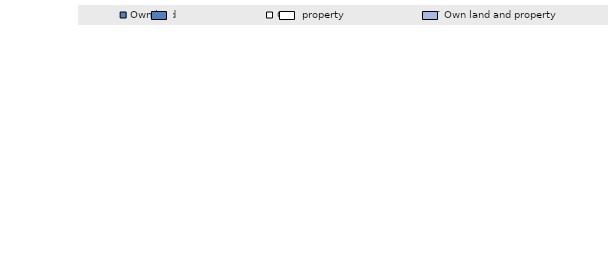
| Category | Own land | Own property | Own land and property |
|---|---|---|---|
| 0 | 5.7 | 16.5 | 3.1 |
| 1 | 4.6 | 12.8 | 3.1 |
| 2 | 15.6 | 1 | 1.2 |
| 3 | 17.4 | 3 | 1.6 |
| 4 | 8.5 | 0.7 | 0.4 |
| 5 | 8.2 | 0.8 | 0.2 |
| 6 | 24.4 | 11.8 | 4.7 |
| 7 | 10 | 6.7 | 2.5 |
| 8 | 18.7 | 5 | 3.9 |
| 9 | 17.3 | 3.5 | 3.6 |
| 10 | 5.1 | 10.2 | 6.8 |
| 11 | 4.9 | 5.6 | 1.6 |
| 12 | 16.2 | 10.7 | 3.6 |
| 13 | 16.1 | 8.6 | 3.6 |
| 14 | 21.1 | 10.5 | 10.5 |
| 15 | 21.6 | 9.54 | 2.8 |
| 16 | 21.2 | 6 | 3.2 |
| 17 | 17.5 | 1.8 | 1.5 |
| 18 | 61.7 | 1.8 | 6 |
| 19 | 49.4 | 1.2 | 2.5 |